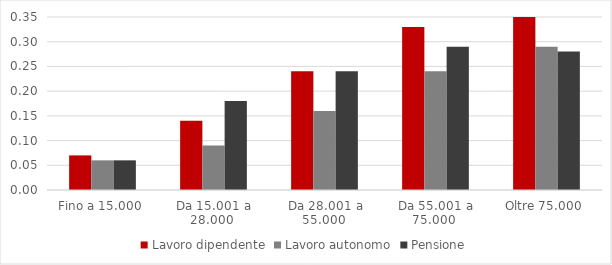
| Category | Lavoro dipendente | Lavoro autonomo | Pensione |
|---|---|---|---|
| Fino a 15.000  | 0.07 | 0.06 | 0.06 |
| Da 15.001 a 28.000  | 0.14 | 0.09 | 0.18 |
| Da 28.001 a 55.000  | 0.24 | 0.16 | 0.24 |
| Da 55.001 a 75.000  | 0.33 | 0.24 | 0.29 |
| Oltre 75.000  | 0.38 | 0.29 | 0.28 |